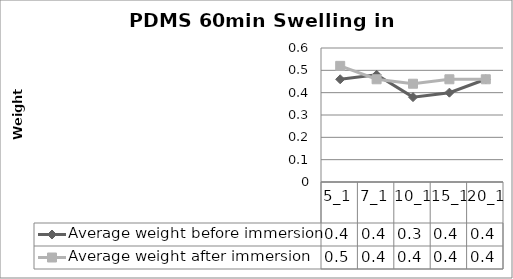
| Category | Average weight before immersion | Average weight after immersion |
|---|---|---|
| 5_1 | 0.46 | 0.52 |
| 7_1 | 0.48 | 0.46 |
| 10_1 | 0.38 | 0.44 |
| 15_1 | 0.4 | 0.46 |
| 20_1 | 0.46 | 0.46 |